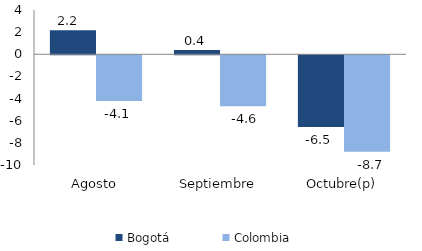
| Category | Bogotá | Colombia |
|---|---|---|
| Agosto | 2.181 | -4.118 |
| Septiembre | 0.383 | -4.6 |
| Octubre(p) | -6.473 | -8.713 |